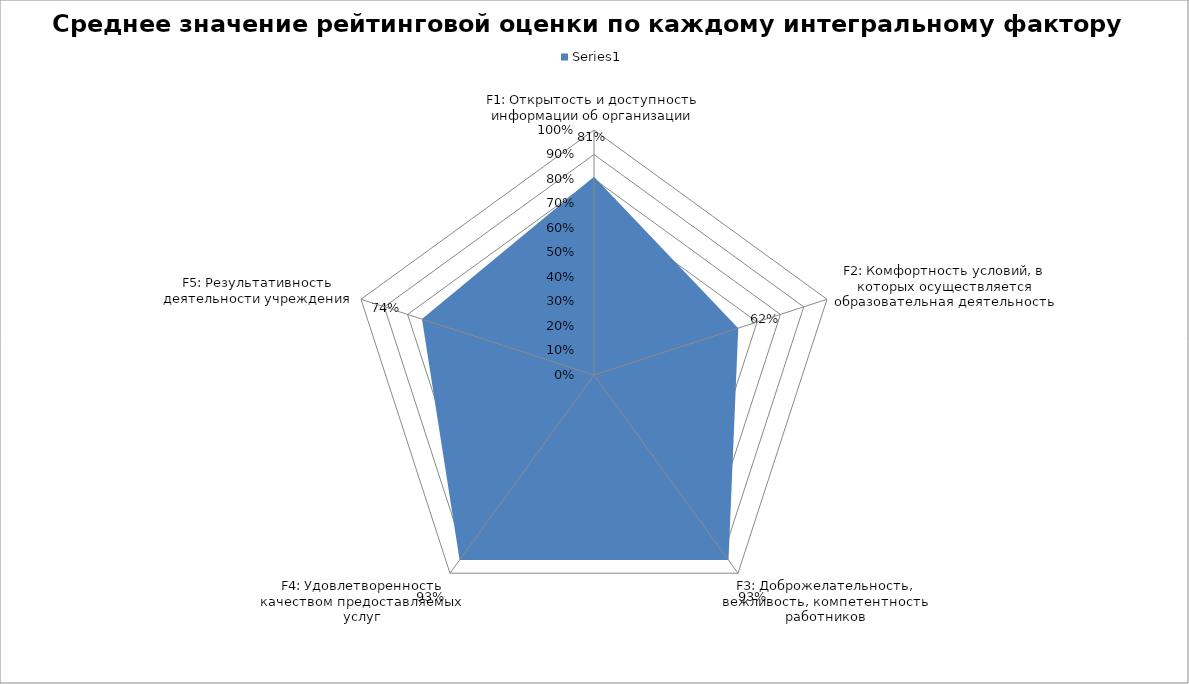
| Category | Series 0 |
|---|---|
| F1: Открытость и доступность информации об организации | 0.809 |
| F2: Комфортность условий, в которых осуществляется образовательная деятельность | 0.619 |
| F3: Доброжелательность, вежливость, компетентность работников | 0.934 |
| F4: Удовлетворенность качеством предоставляемых услуг | 0.933 |
| F5: Результативность деятельности учреждения | 0.738 |